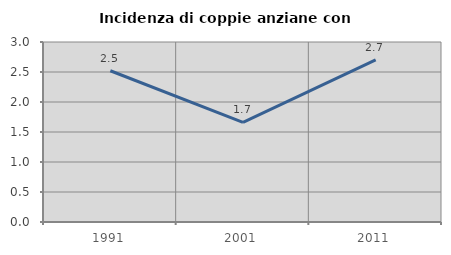
| Category | Incidenza di coppie anziane con figli |
|---|---|
| 1991.0 | 2.521 |
| 2001.0 | 1.66 |
| 2011.0 | 2.703 |